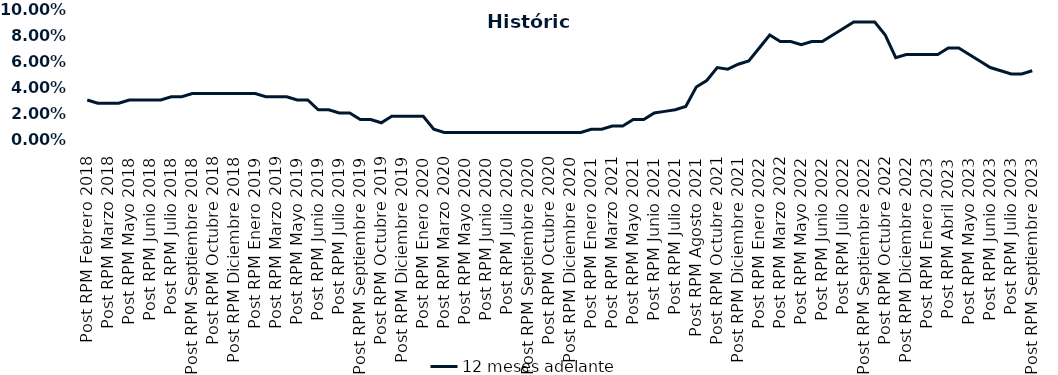
| Category | 12 meses adelante  |
|---|---|
| Post RPM Febrero 2018 | 0.03 |
| Pre RPM Marzo 2018 | 0.028 |
| Post RPM Marzo 2018 | 0.028 |
| Pre RPM Mayo 2018 | 0.028 |
| Post RPM Mayo 2018 | 0.03 |
| Pre RPM Junio 2018 | 0.03 |
| Post RPM Junio 2018 | 0.03 |
| Pre RPM Julio 2018 | 0.03 |
| Post RPM Julio 2018 | 0.032 |
| Pre RPM Septiembre 2018 | 0.032 |
| Post RPM Septiembre 2018 | 0.035 |
| Pre RPM Octubre 2018 | 0.035 |
| Post RPM Octubre 2018 | 0.035 |
| Pre RPM Diciembre 2018 | 0.035 |
| Post RPM Diciembre 2018 | 0.035 |
| Pre RPM Enero 2019 | 0.035 |
| Post RPM Enero 2019 | 0.035 |
| Pre RPM Marzo 2019 | 0.032 |
| Post RPM Marzo 2019 | 0.032 |
| Pre RPM Mayo 2019 | 0.032 |
| Post RPM Mayo 2019 | 0.03 |
| Pre RPM Junio 2019 | 0.03 |
| Post RPM Junio 2019 | 0.022 |
| Pre RPM Julio 2019 | 0.022 |
| Post RPM Julio 2019 | 0.02 |
| Pre RPM Septiembre 2019 | 0.02 |
| Post RPM Septiembre 2019 | 0.015 |
| Pre RPM Octubre 2019 | 0.015 |
| Post RPM Octubre 2019 | 0.012 |
| Pre RPM Diciembre 2019 | 0.018 |
| Post RPM Diciembre 2019 | 0.018 |
| Pre RPM Enero 2020 | 0.018 |
| Post RPM Enero 2020 | 0.018 |
| Pre RPM Marzo 2020 | 0.008 |
| Post RPM Marzo 2020 | 0.005 |
| Pre RPM Mayo 2020 | 0.005 |
| Post RPM Mayo 2020 | 0.005 |
| Pre RPM Junio 2020 | 0.005 |
| Post RPM Junio 2020 | 0.005 |
| Pre RPM Julio 2020 | 0.005 |
| Post RPM Julio 2020 | 0.005 |
| Pre RPM Septiembre 2020 | 0.005 |
| Post RPM Septiembre 2020 | 0.005 |
| Pre RPM Octubre 2020 | 0.005 |
| Post RPM Octubre 2020 | 0.005 |
| Pre RPM Diciembre 2020 | 0.005 |
| Post RPM Diciembre 2020 | 0.005 |
| Pre RPM Enero 2021 | 0.005 |
| Post RPM Enero 2021 | 0.008 |
| Pre RPM Marzo 2021 | 0.008 |
| Post RPM Marzo 2021 | 0.01 |
| Pre RPM Mayo 2021 | 0.01 |
| Post RPM Mayo 2021 | 0.015 |
| Pre RPM Junio 2021 | 0.015 |
| Post RPM Junio 2021 | 0.02 |
| Pre RPM Julio 2021 | 0.021 |
| Post RPM Julio 2021 | 0.022 |
| Pre RPM Agosto 2021 | 0.025 |
| Post RPM Agosto 2021 | 0.04 |
| Pre RPM Octubre 2021 | 0.045 |
| Post RPM Octubre 2021 | 0.055 |
| Pre RPM Diciembre 2021 | 0.054 |
| Post RPM Diciembre 2021 | 0.058 |
| Pre RPM Enero 2022 | 0.06 |
| Post RPM Enero 2022 | 0.07 |
| Pre RPM Marzo 2022 | 0.08 |
| Post RPM Marzo 2022 | 0.075 |
| Pre RPM Mayo 2022 | 0.075 |
| Post RPM Mayo 2022 | 0.072 |
| Pre RPM Junio 2022 | 0.075 |
| Post RPM Junio 2022 | 0.075 |
| Pre RPM Julio 2022 | 0.08 |
| Post RPM Julio 2022 | 0.085 |
| Pre RPM Septiembre 2022 | 0.09 |
| Post RPM Septiembre 2022 | 0.09 |
| Pre RPM Octubre 2022 | 0.09 |
| Post RPM Octubre 2022 | 0.08 |
| Pre RPM Diciembre 2022 | 0.062 |
| Post RPM Diciembre 2022 | 0.065 |
| Pre RPM Enero 2023 | 0.065 |
| Post RPM Enero 2023 | 0.065 |
| Pre RPM Abril 2023 | 0.065 |
| Post RPM Abril 2023 | 0.07 |
| Pre RPM Mayo 2023 | 0.07 |
| Post RPM Mayo 2023 | 0.065 |
| Pre RPM Junio 2023 | 0.06 |
| Post RPM Junio 2023 | 0.055 |
| Pre RPM Julio 2023 | 0.052 |
| Post RPM Julio 2023 | 0.05 |
| Pre RPM Septiembre 2023 | 0.05 |
| Post RPM Septiembre 2023 | 0.052 |